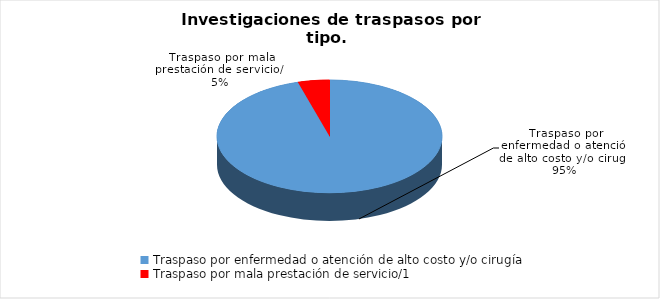
| Category | Series 0 |
|---|---|
| Traspaso por enfermedad o atención de alto costo y/o cirugía | 316 |
| Traspaso por mala prestación de servicio/1 | 15 |